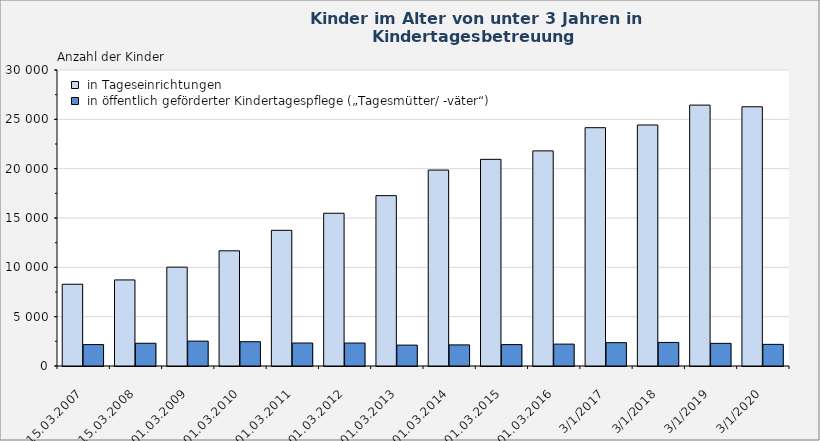
| Category |  in Tageseinrichtungen |  in öffentlich geförderter Kindertagespflege („Tagesmütter/ -väter“) |
|---|---|---|
| 15.03.2007 | 8286 | 2171 |
| 15.03.2008 | 8723 | 2304 |
| 01.03.2009 | 10017 | 2521 |
| 01.03.2010 | 11673 | 2460 |
| 01.03.2011 | 13753 | 2328 |
| 01.03.2012 | 15480 | 2327 |
| 01.03.2013 | 17266 | 2117 |
| 01.03.2014 | 19857 | 2138 |
| 01.03.2015 | 20945 | 2168 |
| 01.03.2016 | 21803 | 2219 |
| 01.03.2017 | 24153 | 2365 |
| 01.03.2018 | 24428 | 2387 |
| 01.03.2019 | 26442 | 2296 |
| 01.03.2020 | 26273 | 2192 |